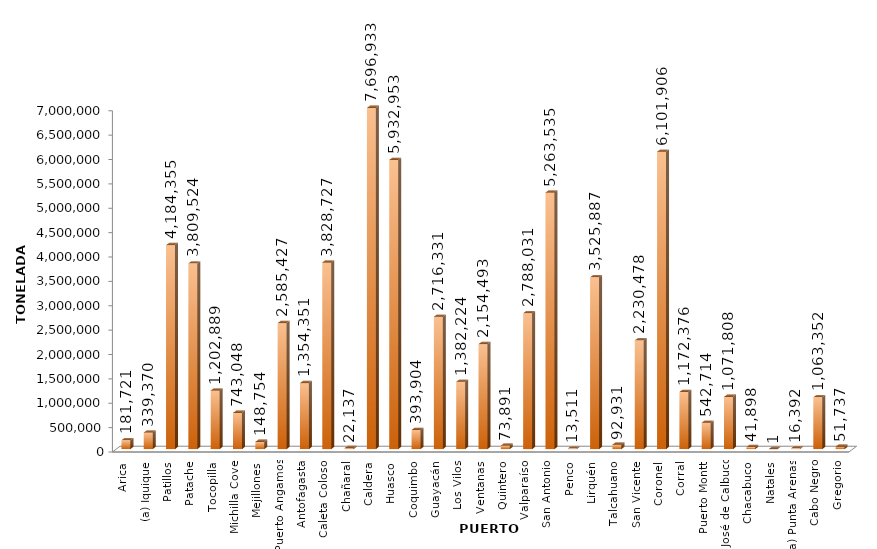
| Category | Series 0 |
|---|---|
| Arica | 181720.918 |
| (a) Iquique | 339369.607 |
| Patillos | 4184355 |
| Patache | 3809524.05 |
| Tocopilla | 1202888.688 |
| Michilla Cove | 743047.943 |
| Mejillones | 148753.607 |
| Puerto Angamos | 2585426.552 |
| Antofagasta | 1354350.812 |
| Caleta Coloso | 3828727.157 |
| Chañaral | 22136.521 |
| Caldera | 7696932.518 |
| Huasco | 5932953.172 |
| Coquimbo | 393904.236 |
| Guayacán | 2716330.729 |
| Los Vilos | 1382223.74 |
| Ventanas | 2154492.542 |
| Quintero | 73890.893 |
| Valparaíso | 2788030.763 |
| San Antonio | 5263535.122 |
| Penco | 13510.51 |
| Lirquén | 3525887.079 |
| Talcahuano | 92931.18 |
| San Vicente | 2230478.014 |
| Coronel | 6101906.012 |
| Corral | 1172376.141 |
| Puerto Montt | 542714.106 |
| San José de Calbuco | 1071807.935 |
| Chacabuco | 41898.241 |
| Natales | 0.55 |
| (a) Punta Arenas | 16391.952 |
| Cabo Negro | 1063351.852 |
| Gregorio | 51737.386 |